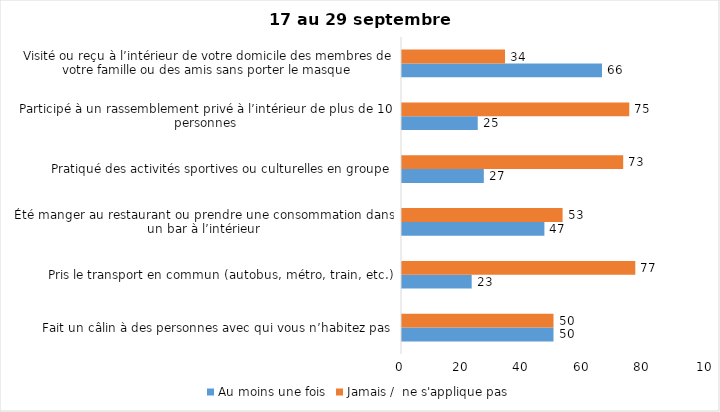
| Category | Au moins une fois | Jamais /  ne s'applique pas |
|---|---|---|
| Fait un câlin à des personnes avec qui vous n’habitez pas | 50 | 50 |
| Pris le transport en commun (autobus, métro, train, etc.) | 23 | 77 |
| Été manger au restaurant ou prendre une consommation dans un bar à l’intérieur | 47 | 53 |
| Pratiqué des activités sportives ou culturelles en groupe | 27 | 73 |
| Participé à un rassemblement privé à l’intérieur de plus de 10 personnes | 25 | 75 |
| Visité ou reçu à l’intérieur de votre domicile des membres de votre famille ou des amis sans porter le masque | 66 | 34 |